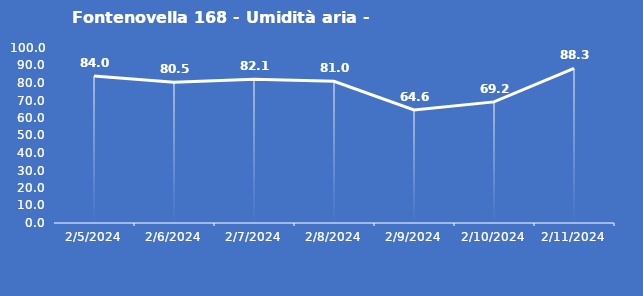
| Category | Fontenovella 168 - Umidità aria - Grezzo (%) |
|---|---|
| 2/5/24 | 84 |
| 2/6/24 | 80.5 |
| 2/7/24 | 82.1 |
| 2/8/24 | 81 |
| 2/9/24 | 64.6 |
| 2/10/24 | 69.2 |
| 2/11/24 | 88.3 |